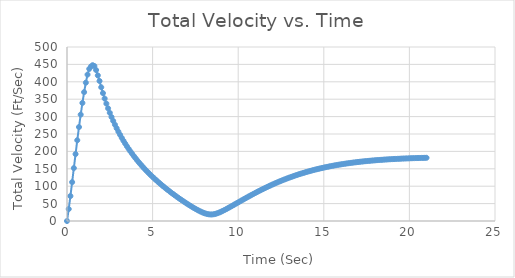
| Category | Series 0 |
|---|---|
| 0.0 | 0 |
| 0.1 | 34.398 |
| 0.2 | 71.659 |
| 0.30000000000000004 | 111.672 |
| 0.4 | 152.068 |
| 0.5 | 192.369 |
| 0.6 | 232.08 |
| 0.7 | 269.932 |
| 0.7999999999999999 | 305.704 |
| 0.8999999999999999 | 339.206 |
| 0.9999999999999999 | 370.287 |
| 1.0999999999999999 | 397.457 |
| 1.2 | 420.68 |
| 1.3 | 437.124 |
| 1.4000000000000001 | 444.059 |
| 1.5000000000000002 | 447.726 |
| 1.6000000000000003 | 445.241 |
| 1.7000000000000004 | 433.787 |
| 1.8000000000000005 | 418.408 |
| 1.9000000000000006 | 402.41 |
| 2.0000000000000004 | 384.293 |
| 2.1000000000000005 | 367.504 |
| 2.2000000000000006 | 351.89 |
| 2.3000000000000007 | 337.32 |
| 2.400000000000001 | 323.682 |
| 2.500000000000001 | 310.882 |
| 2.600000000000001 | 298.834 |
| 2.700000000000001 | 287.466 |
| 2.800000000000001 | 276.715 |
| 2.9000000000000012 | 266.525 |
| 3.0000000000000013 | 256.847 |
| 3.1000000000000014 | 247.635 |
| 3.2000000000000015 | 238.853 |
| 3.3000000000000016 | 230.465 |
| 3.4000000000000017 | 222.439 |
| 3.5000000000000018 | 214.748 |
| 3.600000000000002 | 207.366 |
| 3.700000000000002 | 200.272 |
| 3.800000000000002 | 193.443 |
| 3.900000000000002 | 186.862 |
| 4.000000000000002 | 180.511 |
| 4.100000000000001 | 174.374 |
| 4.200000000000001 | 168.438 |
| 4.300000000000001 | 162.689 |
| 4.4 | 157.116 |
| 4.5 | 151.707 |
| 4.6 | 146.451 |
| 4.699999999999999 | 141.341 |
| 4.799999999999999 | 136.367 |
| 4.899999999999999 | 131.52 |
| 4.999999999999998 | 126.795 |
| 5.099999999999998 | 122.183 |
| 5.1999999999999975 | 117.678 |
| 5.299999999999997 | 113.275 |
| 5.399999999999997 | 108.968 |
| 5.4999999999999964 | 104.752 |
| 5.599999999999996 | 100.622 |
| 5.699999999999996 | 96.574 |
| 5.799999999999995 | 92.604 |
| 5.899999999999995 | 88.708 |
| 5.999999999999995 | 84.883 |
| 6.099999999999994 | 81.126 |
| 6.199999999999994 | 77.434 |
| 6.299999999999994 | 73.805 |
| 6.399999999999993 | 70.237 |
| 6.499999999999993 | 66.729 |
| 6.5999999999999925 | 63.278 |
| 6.699999999999992 | 59.886 |
| 6.799999999999992 | 56.551 |
| 6.8999999999999915 | 53.274 |
| 6.999999999999991 | 50.058 |
| 7.099999999999991 | 46.904 |
| 7.19999999999999 | 43.818 |
| 7.29999999999999 | 40.804 |
| 7.39999999999999 | 37.872 |
| 7.499999999999989 | 35.032 |
| 7.599999999999989 | 32.3 |
| 7.699999999999989 | 29.697 |
| 7.799999999999988 | 27.252 |
| 7.899999999999988 | 25.001 |
| 7.999999999999988 | 22.995 |
| 8.099999999999987 | 21.294 |
| 8.199999999999987 | 19.971 |
| 8.299999999999986 | 19.103 |
| 8.399999999999986 | 18.753 |
| 8.499999999999986 | 18.953 |
| 8.599999999999985 | 19.691 |
| 8.699999999999985 | 20.912 |
| 8.799999999999985 | 22.534 |
| 8.899999999999984 | 24.474 |
| 8.999999999999984 | 26.658 |
| 9.099999999999984 | 29.024 |
| 9.199999999999983 | 31.525 |
| 9.299999999999983 | 34.126 |
| 9.399999999999983 | 36.8 |
| 9.499999999999982 | 39.526 |
| 9.599999999999982 | 42.288 |
| 9.699999999999982 | 45.074 |
| 9.799999999999981 | 47.875 |
| 9.89999999999998 | 50.682 |
| 9.99999999999998 | 53.488 |
| 10.09999999999998 | 56.289 |
| 10.19999999999998 | 59.08 |
| 10.29999999999998 | 61.857 |
| 10.399999999999979 | 64.616 |
| 10.499999999999979 | 67.355 |
| 10.599999999999978 | 70.071 |
| 10.699999999999978 | 72.762 |
| 10.799999999999978 | 75.426 |
| 10.899999999999977 | 78.06 |
| 10.999999999999977 | 80.664 |
| 11.099999999999977 | 83.236 |
| 11.199999999999976 | 85.774 |
| 11.299999999999976 | 88.277 |
| 11.399999999999975 | 90.745 |
| 11.499999999999975 | 93.176 |
| 11.599999999999975 | 95.57 |
| 11.699999999999974 | 97.925 |
| 11.799999999999974 | 100.242 |
| 11.899999999999974 | 102.52 |
| 11.999999999999973 | 104.757 |
| 12.099999999999973 | 106.955 |
| 12.199999999999973 | 109.112 |
| 12.299999999999972 | 111.228 |
| 12.399999999999972 | 113.303 |
| 12.499999999999972 | 115.337 |
| 12.599999999999971 | 117.33 |
| 12.69999999999997 | 119.282 |
| 12.79999999999997 | 121.193 |
| 12.89999999999997 | 123.062 |
| 12.99999999999997 | 124.891 |
| 13.09999999999997 | 126.68 |
| 13.199999999999969 | 128.427 |
| 13.299999999999969 | 130.135 |
| 13.399999999999968 | 131.803 |
| 13.499999999999968 | 133.431 |
| 13.599999999999968 | 135.021 |
| 13.699999999999967 | 136.571 |
| 13.799999999999967 | 138.083 |
| 13.899999999999967 | 139.558 |
| 13.999999999999966 | 140.995 |
| 14.099999999999966 | 142.395 |
| 14.199999999999966 | 143.758 |
| 14.299999999999965 | 145.086 |
| 14.399999999999965 | 146.379 |
| 14.499999999999964 | 147.637 |
| 14.599999999999964 | 148.861 |
| 14.699999999999964 | 150.051 |
| 14.799999999999963 | 151.208 |
| 14.899999999999963 | 152.333 |
| 14.999999999999963 | 153.426 |
| 15.099999999999962 | 154.488 |
| 15.199999999999962 | 155.52 |
| 15.299999999999962 | 156.521 |
| 15.399999999999961 | 157.493 |
| 15.499999999999961 | 158.437 |
| 15.59999999999996 | 159.352 |
| 15.69999999999996 | 160.24 |
| 15.79999999999996 | 161.101 |
| 15.89999999999996 | 161.936 |
| 15.99999999999996 | 162.746 |
| 16.09999999999996 | 163.53 |
| 16.19999999999996 | 164.29 |
| 16.29999999999996 | 165.026 |
| 16.399999999999963 | 165.739 |
| 16.499999999999964 | 166.429 |
| 16.599999999999966 | 167.097 |
| 16.699999999999967 | 167.743 |
| 16.79999999999997 | 168.369 |
| 16.89999999999997 | 168.974 |
| 16.99999999999997 | 169.559 |
| 17.099999999999973 | 170.124 |
| 17.199999999999974 | 170.671 |
| 17.299999999999976 | 171.2 |
| 17.399999999999977 | 171.71 |
| 17.49999999999998 | 172.204 |
| 17.59999999999998 | 172.68 |
| 17.69999999999998 | 173.14 |
| 17.799999999999983 | 173.584 |
| 17.899999999999984 | 174.012 |
| 17.999999999999986 | 174.426 |
| 18.099999999999987 | 174.825 |
| 18.19999999999999 | 175.209 |
| 18.29999999999999 | 175.58 |
| 18.39999999999999 | 175.938 |
| 18.499999999999993 | 176.282 |
| 18.599999999999994 | 176.614 |
| 18.699999999999996 | 176.934 |
| 18.799999999999997 | 177.241 |
| 18.9 | 177.538 |
| 19.0 | 177.823 |
| 19.1 | 178.097 |
| 19.200000000000003 | 178.361 |
| 19.300000000000004 | 178.615 |
| 19.400000000000006 | 178.858 |
| 19.500000000000007 | 179.093 |
| 19.60000000000001 | 179.318 |
| 19.70000000000001 | 179.534 |
| 19.80000000000001 | 179.741 |
| 19.900000000000013 | 179.94 |
| 20.000000000000014 | 180.131 |
| 20.100000000000016 | 180.314 |
| 20.200000000000017 | 180.489 |
| 20.30000000000002 | 180.657 |
| 20.40000000000002 | 180.818 |
| 20.50000000000002 | 180.971 |
| 20.600000000000023 | 181.119 |
| 20.700000000000024 | 181.259 |
| 20.800000000000026 | 181.393 |
| 20.900000000000027 | 181.522 |
| 21.00000000000003 | 181.644 |